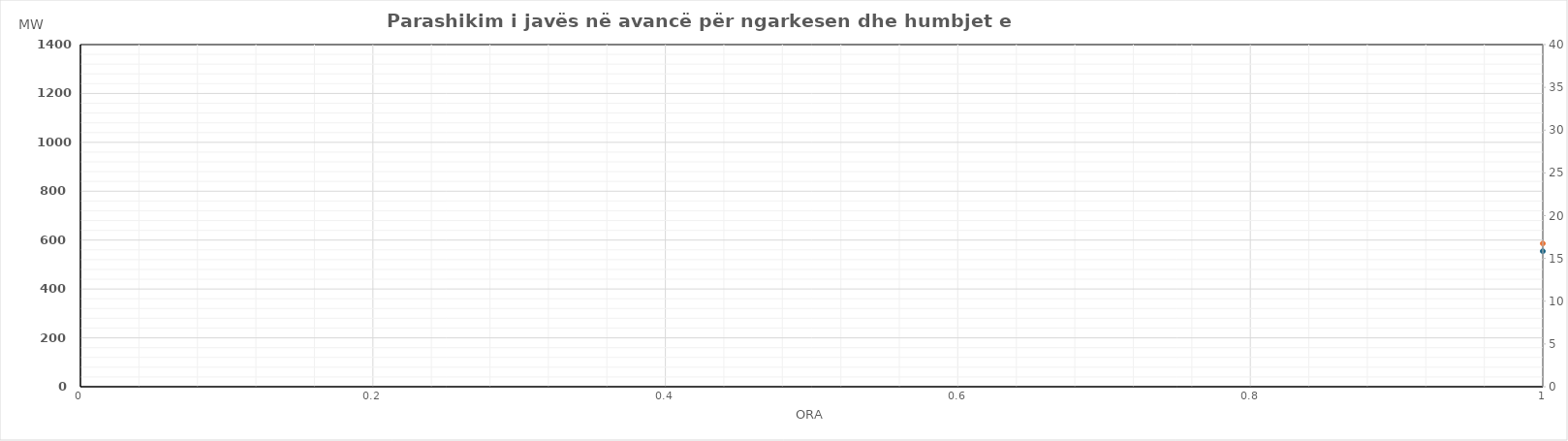
| Category | Ngarkesa (MWh) |
|---|---|
| 0 | 586.23 |
| 1 | 521.03 |
| 2 | 530.84 |
| 3 | 527.02 |
| 4 | 537.59 |
| 5 | 601.36 |
| 6 | 774.67 |
| 7 | 985.7 |
| 8 | 1025.06 |
| 9 | 1003.7 |
| 10 | 963.38 |
| 11 | 900.26 |
| 12 | 887.54 |
| 13 | 843.06 |
| 14 | 822.92 |
| 15 | 809.75 |
| 16 | 839.16 |
| 17 | 935.88 |
| 18 | 1032.53 |
| 19 | 1028.28 |
| 20 | 994.29 |
| 21 | 899.74 |
| 22 | 758.65 |
| 23 | 603.05 |
| 24 | 565.51 |
| 25 | 498.21 |
| 26 | 527.61 |
| 27 | 538.71 |
| 28 | 548.51 |
| 29 | 584.04 |
| 30 | 724.18 |
| 31 | 914.06 |
| 32 | 962.47 |
| 33 | 962.66 |
| 34 | 904.79 |
| 35 | 970.29 |
| 36 | 956.13 |
| 37 | 968.57 |
| 38 | 857.06 |
| 39 | 865.94 |
| 40 | 948.31 |
| 41 | 1036.6 |
| 42 | 1120.78 |
| 43 | 1127.08 |
| 44 | 1107.61 |
| 45 | 1016.12 |
| 46 | 869.6 |
| 47 | 683.31 |
| 48 | 614.41 |
| 49 | 536.51 |
| 50 | 534.8 |
| 51 | 534.78 |
| 52 | 545.41 |
| 53 | 596.92 |
| 54 | 753.97 |
| 55 | 954.25 |
| 56 | 991.57 |
| 57 | 960.48 |
| 58 | 913.36 |
| 59 | 835.95 |
| 60 | 817.82 |
| 61 | 834.16 |
| 62 | 814.84 |
| 63 | 834.43 |
| 64 | 870.81 |
| 65 | 1026.22 |
| 66 | 1132.09 |
| 67 | 1133.72 |
| 68 | 1106.31 |
| 69 | 1013.33 |
| 70 | 865.03 |
| 71 | 704.33 |
| 72 | 573.31 |
| 73 | 526.01 |
| 74 | 550.49 |
| 75 | 592.91 |
| 76 | 598.31 |
| 77 | 618.04 |
| 78 | 781.27 |
| 79 | 950.15 |
| 80 | 977.27 |
| 81 | 937.42 |
| 82 | 885.49 |
| 83 | 853.96 |
| 84 | 847.24 |
| 85 | 872.98 |
| 86 | 805.3 |
| 87 | 821.2 |
| 88 | 863.11 |
| 89 | 994.91 |
| 90 | 1128.28 |
| 91 | 1133.1 |
| 92 | 1107.61 |
| 93 | 1004.41 |
| 94 | 864.11 |
| 95 | 713.72 |
| 96 | 600.12 |
| 97 | 533.22 |
| 98 | 534.1 |
| 99 | 568.8 |
| 100 | 590 |
| 101 | 617.54 |
| 102 | 708.48 |
| 103 | 847.76 |
| 104 | 940.69 |
| 105 | 941.79 |
| 106 | 906.56 |
| 107 | 981.76 |
| 108 | 969.04 |
| 109 | 974.85 |
| 110 | 940.73 |
| 111 | 919.63 |
| 112 | 972.86 |
| 113 | 1057.63 |
| 114 | 1145 |
| 115 | 1146.58 |
| 116 | 1117.11 |
| 117 | 1030.41 |
| 118 | 897.3 |
| 119 | 763.7 |
| 120 | 661.54 |
| 121 | 600.22 |
| 122 | 560.71 |
| 123 | 593.34 |
| 124 | 600.03 |
| 125 | 623.88 |
| 126 | 739.05 |
| 127 | 894.3 |
| 128 | 980.5 |
| 129 | 982.82 |
| 130 | 946.81 |
| 131 | 921.76 |
| 132 | 913.69 |
| 133 | 925.98 |
| 134 | 886.88 |
| 135 | 901.82 |
| 136 | 904.46 |
| 137 | 1006.88 |
| 138 | 1117.18 |
| 139 | 1133.3 |
| 140 | 1099.48 |
| 141 | 1008.87 |
| 142 | 859.91 |
| 143 | 704.21 |
| 144 | 681.18 |
| 145 | 602.38 |
| 146 | 535.46 |
| 147 | 587.67 |
| 148 | 570.27 |
| 149 | 574.79 |
| 150 | 653.54 |
| 151 | 783.89 |
| 152 | 863.14 |
| 153 | 886.14 |
| 154 | 867.61 |
| 155 | 858.24 |
| 156 | 869.59 |
| 157 | 874.81 |
| 158 | 863.41 |
| 159 | 874.11 |
| 160 | 885.66 |
| 161 | 992.53 |
| 162 | 1100.91 |
| 163 | 1131.32 |
| 164 | 1103.44 |
| 165 | 1002.83 |
| 166 | 863.73 |
| 167 | 715.38 |